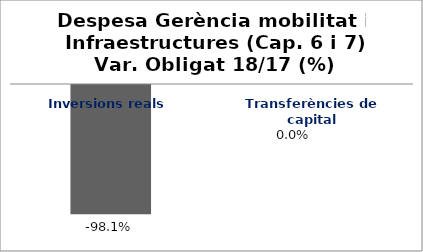
| Category | Series 0 |
|---|---|
| Inversions reals | -0.981 |
| Transferències de capital | 0 |